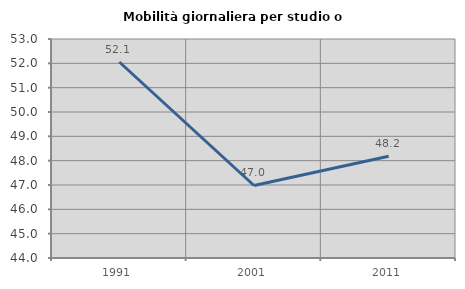
| Category | Mobilità giornaliera per studio o lavoro |
|---|---|
| 1991.0 | 52.055 |
| 2001.0 | 46.98 |
| 2011.0 | 48.185 |